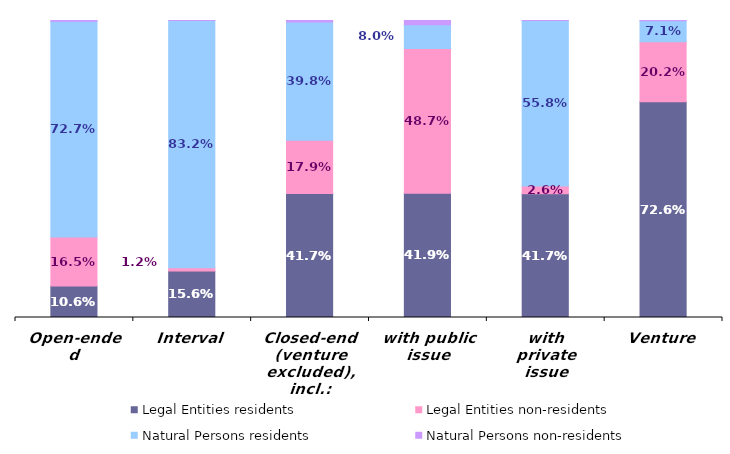
| Category | Legal Entities | Natural Persons |
|---|---|---|
| Open-ended | 0.165 | 0.003 |
| Interval | 0.012 | 0 |
| Closed-end (venture excluded), incl.: | 0.179 | 0.005 |
| with public issue | 0.487 | 0.015 |
| with private issue | 0.026 | 0 |
| Venture | 0.202 | 0.001 |